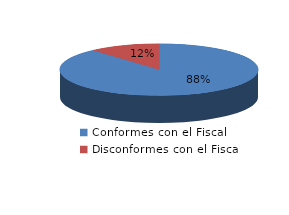
| Category | Series 0 |
|---|---|
| 0 | 500 |
| 1 | 65 |